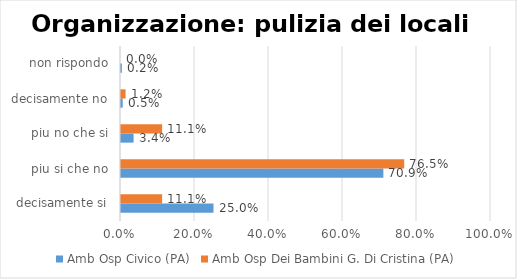
| Category | Amb Osp Civico (PA) | Amb Osp Dei Bambini G. Di Cristina (PA) |
|---|---|---|
| decisamente si | 0.25 | 0.111 |
| piu si che no | 0.709 | 0.765 |
| piu no che si | 0.034 | 0.111 |
| decisamente no | 0.005 | 0.012 |
| non rispondo | 0.002 | 0 |